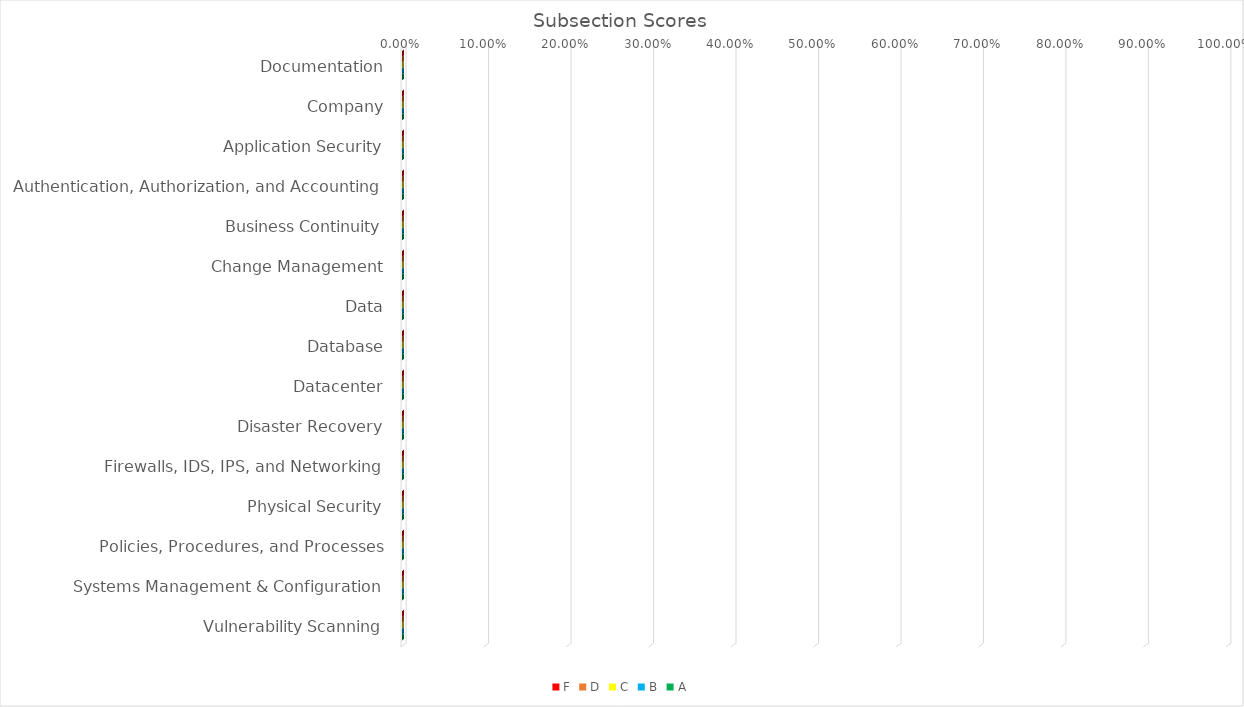
| Category | F | D | C | B | A |
|---|---|---|---|---|---|
| Documentation | 0 | 0 | 0 | 0 | 0 |
| Company | 0 | 0 | 0 | 0 | 0 |
| Application Security | 0 | 0 | 0 | 0 | 0 |
| Authentication, Authorization, and Accounting | 0 | 0 | 0 | 0 | 0 |
| Business Continuity | 0 | 0 | 0 | 0 | 0 |
| Change Management | 0 | 0 | 0 | 0 | 0 |
| Data | 0 | 0 | 0 | 0 | 0 |
| Database | 0 | 0 | 0 | 0 | 0 |
| Datacenter | 0 | 0 | 0 | 0 | 0 |
| Disaster Recovery | 0 | 0 | 0 | 0 | 0 |
| Firewalls, IDS, IPS, and Networking | 0 | 0 | 0 | 0 | 0 |
| Physical Security | 0 | 0 | 0 | 0 | 0 |
| Policies, Procedures, and Processes | 0 | 0 | 0 | 0 | 0 |
| Systems Management & Configuration | 0 | 0 | 0 | 0 | 0 |
| Vulnerability Scanning | 0 | 0 | 0 | 0 | 0 |